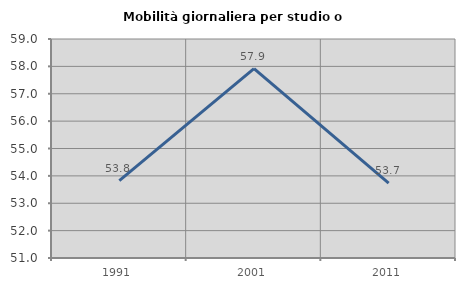
| Category | Mobilità giornaliera per studio o lavoro |
|---|---|
| 1991.0 | 53.825 |
| 2001.0 | 57.92 |
| 2011.0 | 53.737 |